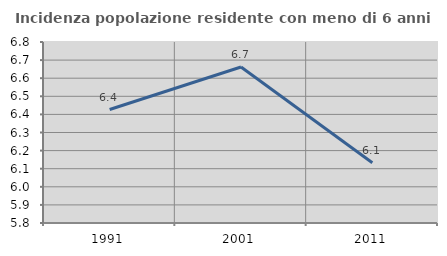
| Category | Incidenza popolazione residente con meno di 6 anni |
|---|---|
| 1991.0 | 6.427 |
| 2001.0 | 6.662 |
| 2011.0 | 6.133 |